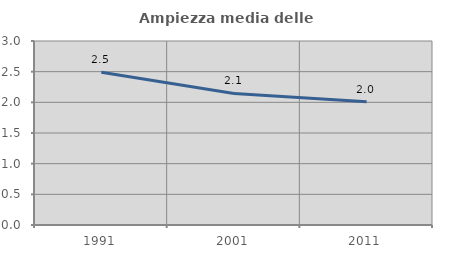
| Category | Ampiezza media delle famiglie |
|---|---|
| 1991.0 | 2.49 |
| 2001.0 | 2.145 |
| 2011.0 | 2.009 |